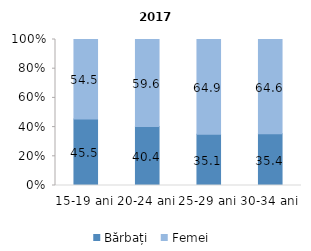
| Category | Bărbați  | Femei |
|---|---|---|
| 15-19 ani | 45.5 | 54.5 |
| 20-24 ani | 40.4 | 59.6 |
| 25-29 ani | 35.1 | 64.9 |
| 30-34 ani | 35.4 | 64.6 |